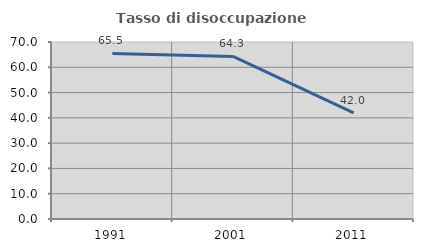
| Category | Tasso di disoccupazione giovanile  |
|---|---|
| 1991.0 | 65.455 |
| 2001.0 | 64.286 |
| 2011.0 | 42 |